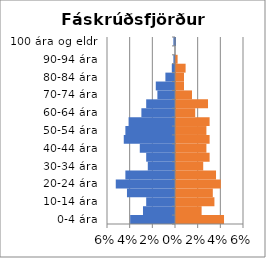
| Category | % karlar | %konur |
|---|---|---|
| 0-4 ára | -0.04 | 0.042 |
| 5-9 ára | -0.028 | 0.023 |
| 10-14 ára | -0.025 | 0.034 |
| 15-19 ára | -0.042 | 0.032 |
| 20-24 ára | -0.052 | 0.04 |
| 25-29 ára | -0.044 | 0.035 |
| 30-34 ára | -0.024 | 0.024 |
| 35-39 ára | -0.025 | 0.03 |
| 40-44 ára | -0.031 | 0.027 |
| 45-49 ára | -0.045 | 0.03 |
| 50-54 ára | -0.044 | 0.027 |
| 55-59 ára | -0.041 | 0.03 |
| 60-64 ára | -0.03 | 0.017 |
| 65-69 ára | -0.025 | 0.028 |
| 70-74 ára | -0.016 | 0.014 |
| 75-79 ára | -0.017 | 0.007 |
| 80-84 ára | -0.008 | 0.007 |
| 85-89 ára | -0.003 | 0.008 |
| 90-94 ára | -0.001 | 0.001 |
| 95-99 ára | 0 | 0 |
| 100 ára og eldri | -0.001 | 0 |